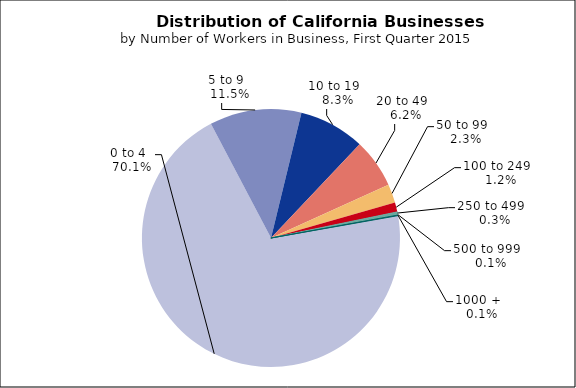
| Category | Series 0 |
|---|---|
| 0 to 4   | 0.701 |
| 5 to 9   | 0.115 |
| 10 to 19   | 0.083 |
| 20 to 49   | 0.062 |
| 50 to 99   | 0.023 |
| 100 to 249   | 0.012 |
| 250 to 499   | 0.003 |
| 500 to 999   | 0.001 |
| 1000 +   | 0.001 |